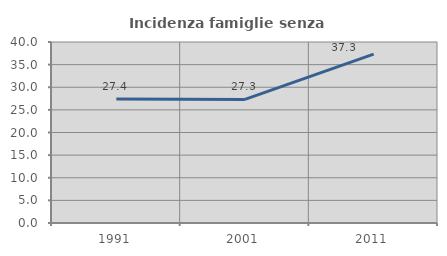
| Category | Incidenza famiglie senza nuclei |
|---|---|
| 1991.0 | 27.428 |
| 2001.0 | 27.312 |
| 2011.0 | 37.304 |